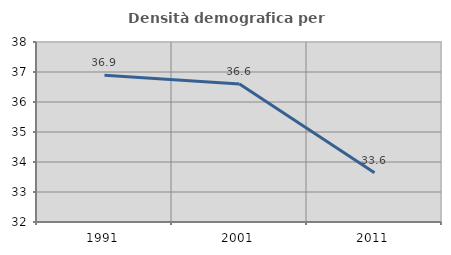
| Category | Densità demografica |
|---|---|
| 1991.0 | 36.889 |
| 2001.0 | 36.598 |
| 2011.0 | 33.641 |